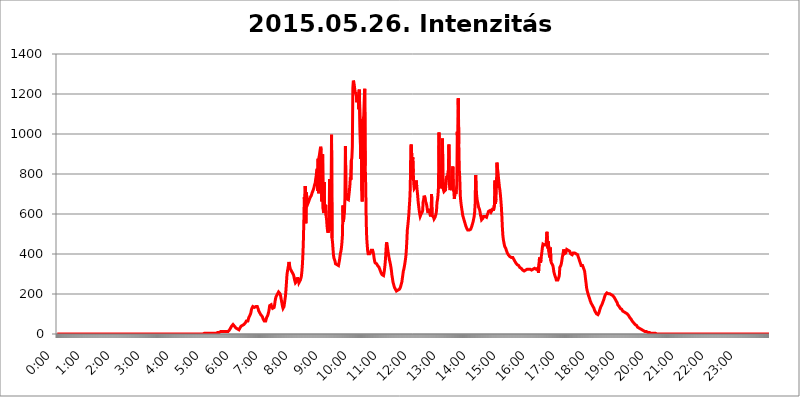
| Category | 2015.05.26. Intenzitás [W/m^2] |
|---|---|
| 0.0 | 0 |
| 0.0006944444444444445 | 0 |
| 0.001388888888888889 | 0 |
| 0.0020833333333333333 | 0 |
| 0.002777777777777778 | 0 |
| 0.003472222222222222 | 0 |
| 0.004166666666666667 | 0 |
| 0.004861111111111111 | 0 |
| 0.005555555555555556 | 0 |
| 0.0062499999999999995 | 0 |
| 0.006944444444444444 | 0 |
| 0.007638888888888889 | 0 |
| 0.008333333333333333 | 0 |
| 0.009027777777777779 | 0 |
| 0.009722222222222222 | 0 |
| 0.010416666666666666 | 0 |
| 0.011111111111111112 | 0 |
| 0.011805555555555555 | 0 |
| 0.012499999999999999 | 0 |
| 0.013194444444444444 | 0 |
| 0.013888888888888888 | 0 |
| 0.014583333333333332 | 0 |
| 0.015277777777777777 | 0 |
| 0.015972222222222224 | 0 |
| 0.016666666666666666 | 0 |
| 0.017361111111111112 | 0 |
| 0.018055555555555557 | 0 |
| 0.01875 | 0 |
| 0.019444444444444445 | 0 |
| 0.02013888888888889 | 0 |
| 0.020833333333333332 | 0 |
| 0.02152777777777778 | 0 |
| 0.022222222222222223 | 0 |
| 0.02291666666666667 | 0 |
| 0.02361111111111111 | 0 |
| 0.024305555555555556 | 0 |
| 0.024999999999999998 | 0 |
| 0.025694444444444447 | 0 |
| 0.02638888888888889 | 0 |
| 0.027083333333333334 | 0 |
| 0.027777777777777776 | 0 |
| 0.02847222222222222 | 0 |
| 0.029166666666666664 | 0 |
| 0.029861111111111113 | 0 |
| 0.030555555555555555 | 0 |
| 0.03125 | 0 |
| 0.03194444444444445 | 0 |
| 0.03263888888888889 | 0 |
| 0.03333333333333333 | 0 |
| 0.034027777777777775 | 0 |
| 0.034722222222222224 | 0 |
| 0.035416666666666666 | 0 |
| 0.036111111111111115 | 0 |
| 0.03680555555555556 | 0 |
| 0.0375 | 0 |
| 0.03819444444444444 | 0 |
| 0.03888888888888889 | 0 |
| 0.03958333333333333 | 0 |
| 0.04027777777777778 | 0 |
| 0.04097222222222222 | 0 |
| 0.041666666666666664 | 0 |
| 0.042361111111111106 | 0 |
| 0.04305555555555556 | 0 |
| 0.043750000000000004 | 0 |
| 0.044444444444444446 | 0 |
| 0.04513888888888889 | 0 |
| 0.04583333333333334 | 0 |
| 0.04652777777777778 | 0 |
| 0.04722222222222222 | 0 |
| 0.04791666666666666 | 0 |
| 0.04861111111111111 | 0 |
| 0.049305555555555554 | 0 |
| 0.049999999999999996 | 0 |
| 0.05069444444444445 | 0 |
| 0.051388888888888894 | 0 |
| 0.052083333333333336 | 0 |
| 0.05277777777777778 | 0 |
| 0.05347222222222222 | 0 |
| 0.05416666666666667 | 0 |
| 0.05486111111111111 | 0 |
| 0.05555555555555555 | 0 |
| 0.05625 | 0 |
| 0.05694444444444444 | 0 |
| 0.057638888888888885 | 0 |
| 0.05833333333333333 | 0 |
| 0.05902777777777778 | 0 |
| 0.059722222222222225 | 0 |
| 0.06041666666666667 | 0 |
| 0.061111111111111116 | 0 |
| 0.06180555555555556 | 0 |
| 0.0625 | 0 |
| 0.06319444444444444 | 0 |
| 0.06388888888888888 | 0 |
| 0.06458333333333334 | 0 |
| 0.06527777777777778 | 0 |
| 0.06597222222222222 | 0 |
| 0.06666666666666667 | 0 |
| 0.06736111111111111 | 0 |
| 0.06805555555555555 | 0 |
| 0.06874999999999999 | 0 |
| 0.06944444444444443 | 0 |
| 0.07013888888888889 | 0 |
| 0.07083333333333333 | 0 |
| 0.07152777777777779 | 0 |
| 0.07222222222222223 | 0 |
| 0.07291666666666667 | 0 |
| 0.07361111111111111 | 0 |
| 0.07430555555555556 | 0 |
| 0.075 | 0 |
| 0.07569444444444444 | 0 |
| 0.0763888888888889 | 0 |
| 0.07708333333333334 | 0 |
| 0.07777777777777778 | 0 |
| 0.07847222222222222 | 0 |
| 0.07916666666666666 | 0 |
| 0.0798611111111111 | 0 |
| 0.08055555555555556 | 0 |
| 0.08125 | 0 |
| 0.08194444444444444 | 0 |
| 0.08263888888888889 | 0 |
| 0.08333333333333333 | 0 |
| 0.08402777777777777 | 0 |
| 0.08472222222222221 | 0 |
| 0.08541666666666665 | 0 |
| 0.08611111111111112 | 0 |
| 0.08680555555555557 | 0 |
| 0.08750000000000001 | 0 |
| 0.08819444444444445 | 0 |
| 0.08888888888888889 | 0 |
| 0.08958333333333333 | 0 |
| 0.09027777777777778 | 0 |
| 0.09097222222222222 | 0 |
| 0.09166666666666667 | 0 |
| 0.09236111111111112 | 0 |
| 0.09305555555555556 | 0 |
| 0.09375 | 0 |
| 0.09444444444444444 | 0 |
| 0.09513888888888888 | 0 |
| 0.09583333333333333 | 0 |
| 0.09652777777777777 | 0 |
| 0.09722222222222222 | 0 |
| 0.09791666666666667 | 0 |
| 0.09861111111111111 | 0 |
| 0.09930555555555555 | 0 |
| 0.09999999999999999 | 0 |
| 0.10069444444444443 | 0 |
| 0.1013888888888889 | 0 |
| 0.10208333333333335 | 0 |
| 0.10277777777777779 | 0 |
| 0.10347222222222223 | 0 |
| 0.10416666666666667 | 0 |
| 0.10486111111111111 | 0 |
| 0.10555555555555556 | 0 |
| 0.10625 | 0 |
| 0.10694444444444444 | 0 |
| 0.1076388888888889 | 0 |
| 0.10833333333333334 | 0 |
| 0.10902777777777778 | 0 |
| 0.10972222222222222 | 0 |
| 0.1111111111111111 | 0 |
| 0.11180555555555556 | 0 |
| 0.11180555555555556 | 0 |
| 0.1125 | 0 |
| 0.11319444444444444 | 0 |
| 0.11388888888888889 | 0 |
| 0.11458333333333333 | 0 |
| 0.11527777777777777 | 0 |
| 0.11597222222222221 | 0 |
| 0.11666666666666665 | 0 |
| 0.1173611111111111 | 0 |
| 0.11805555555555557 | 0 |
| 0.11944444444444445 | 0 |
| 0.12013888888888889 | 0 |
| 0.12083333333333333 | 0 |
| 0.12152777777777778 | 0 |
| 0.12222222222222223 | 0 |
| 0.12291666666666667 | 0 |
| 0.12291666666666667 | 0 |
| 0.12361111111111112 | 0 |
| 0.12430555555555556 | 0 |
| 0.125 | 0 |
| 0.12569444444444444 | 0 |
| 0.12638888888888888 | 0 |
| 0.12708333333333333 | 0 |
| 0.16875 | 0 |
| 0.12847222222222224 | 0 |
| 0.12916666666666668 | 0 |
| 0.12986111111111112 | 0 |
| 0.13055555555555556 | 0 |
| 0.13125 | 0 |
| 0.13194444444444445 | 0 |
| 0.1326388888888889 | 0 |
| 0.13333333333333333 | 0 |
| 0.13402777777777777 | 0 |
| 0.13402777777777777 | 0 |
| 0.13472222222222222 | 0 |
| 0.13541666666666666 | 0 |
| 0.1361111111111111 | 0 |
| 0.13749999999999998 | 0 |
| 0.13819444444444443 | 0 |
| 0.1388888888888889 | 0 |
| 0.13958333333333334 | 0 |
| 0.14027777777777778 | 0 |
| 0.14097222222222222 | 0 |
| 0.14166666666666666 | 0 |
| 0.1423611111111111 | 0 |
| 0.14305555555555557 | 0 |
| 0.14375000000000002 | 0 |
| 0.14444444444444446 | 0 |
| 0.1451388888888889 | 0 |
| 0.1451388888888889 | 0 |
| 0.14652777777777778 | 0 |
| 0.14722222222222223 | 0 |
| 0.14791666666666667 | 0 |
| 0.1486111111111111 | 0 |
| 0.14930555555555555 | 0 |
| 0.15 | 0 |
| 0.15069444444444444 | 0 |
| 0.15138888888888888 | 0 |
| 0.15208333333333332 | 0 |
| 0.15277777777777776 | 0 |
| 0.15347222222222223 | 0 |
| 0.15416666666666667 | 0 |
| 0.15486111111111112 | 0 |
| 0.15555555555555556 | 0 |
| 0.15625 | 0 |
| 0.15694444444444444 | 0 |
| 0.15763888888888888 | 0 |
| 0.15833333333333333 | 0 |
| 0.15902777777777777 | 0 |
| 0.15972222222222224 | 0 |
| 0.16041666666666668 | 0 |
| 0.16111111111111112 | 0 |
| 0.16180555555555556 | 0 |
| 0.1625 | 0 |
| 0.16319444444444445 | 0 |
| 0.1638888888888889 | 0 |
| 0.16458333333333333 | 0 |
| 0.16527777777777777 | 0 |
| 0.16597222222222222 | 0 |
| 0.16666666666666666 | 0 |
| 0.1673611111111111 | 0 |
| 0.16805555555555554 | 0 |
| 0.16874999999999998 | 0 |
| 0.16944444444444443 | 0 |
| 0.17013888888888887 | 0 |
| 0.1708333333333333 | 0 |
| 0.17152777777777775 | 0 |
| 0.17222222222222225 | 0 |
| 0.1729166666666667 | 0 |
| 0.17361111111111113 | 0 |
| 0.17430555555555557 | 0 |
| 0.17500000000000002 | 0 |
| 0.17569444444444446 | 0 |
| 0.1763888888888889 | 0 |
| 0.17708333333333334 | 0 |
| 0.17777777777777778 | 0 |
| 0.17847222222222223 | 0 |
| 0.17916666666666667 | 0 |
| 0.1798611111111111 | 0 |
| 0.18055555555555555 | 0 |
| 0.18125 | 0 |
| 0.18194444444444444 | 0 |
| 0.1826388888888889 | 0 |
| 0.18333333333333335 | 0 |
| 0.1840277777777778 | 0 |
| 0.18472222222222223 | 0 |
| 0.18541666666666667 | 0 |
| 0.18611111111111112 | 0 |
| 0.18680555555555556 | 0 |
| 0.1875 | 0 |
| 0.18819444444444444 | 0 |
| 0.18888888888888888 | 0 |
| 0.18958333333333333 | 0 |
| 0.19027777777777777 | 0 |
| 0.1909722222222222 | 0 |
| 0.19166666666666665 | 0 |
| 0.19236111111111112 | 0 |
| 0.19305555555555554 | 0 |
| 0.19375 | 0 |
| 0.19444444444444445 | 0 |
| 0.1951388888888889 | 0 |
| 0.19583333333333333 | 0 |
| 0.19652777777777777 | 0 |
| 0.19722222222222222 | 0 |
| 0.19791666666666666 | 0 |
| 0.1986111111111111 | 0 |
| 0.19930555555555554 | 0 |
| 0.19999999999999998 | 0 |
| 0.20069444444444443 | 0 |
| 0.20138888888888887 | 0 |
| 0.2020833333333333 | 0 |
| 0.2027777777777778 | 0 |
| 0.2034722222222222 | 0 |
| 0.2041666666666667 | 0 |
| 0.20486111111111113 | 0 |
| 0.20555555555555557 | 0 |
| 0.20625000000000002 | 3.525 |
| 0.20694444444444446 | 3.525 |
| 0.2076388888888889 | 3.525 |
| 0.20833333333333334 | 3.525 |
| 0.20902777777777778 | 3.525 |
| 0.20972222222222223 | 3.525 |
| 0.21041666666666667 | 3.525 |
| 0.2111111111111111 | 3.525 |
| 0.21180555555555555 | 3.525 |
| 0.2125 | 3.525 |
| 0.21319444444444444 | 3.525 |
| 0.2138888888888889 | 3.525 |
| 0.21458333333333335 | 3.525 |
| 0.2152777777777778 | 7.887 |
| 0.21597222222222223 | 3.525 |
| 0.21666666666666667 | 3.525 |
| 0.21736111111111112 | 3.525 |
| 0.21805555555555556 | 3.525 |
| 0.21875 | 3.525 |
| 0.21944444444444444 | 3.525 |
| 0.22013888888888888 | 3.525 |
| 0.22083333333333333 | 3.525 |
| 0.22152777777777777 | 3.525 |
| 0.2222222222222222 | 3.525 |
| 0.22291666666666665 | 3.525 |
| 0.2236111111111111 | 3.525 |
| 0.22430555555555556 | 7.887 |
| 0.225 | 7.887 |
| 0.22569444444444445 | 7.887 |
| 0.2263888888888889 | 7.887 |
| 0.22708333333333333 | 7.887 |
| 0.22777777777777777 | 12.257 |
| 0.22847222222222222 | 12.257 |
| 0.22916666666666666 | 12.257 |
| 0.2298611111111111 | 12.257 |
| 0.23055555555555554 | 12.257 |
| 0.23124999999999998 | 12.257 |
| 0.23194444444444443 | 12.257 |
| 0.23263888888888887 | 12.257 |
| 0.2333333333333333 | 12.257 |
| 0.2340277777777778 | 12.257 |
| 0.2347222222222222 | 12.257 |
| 0.2354166666666667 | 12.257 |
| 0.23611111111111113 | 12.257 |
| 0.23680555555555557 | 12.257 |
| 0.23750000000000002 | 12.257 |
| 0.23819444444444446 | 12.257 |
| 0.2388888888888889 | 12.257 |
| 0.23958333333333334 | 12.257 |
| 0.24027777777777778 | 16.636 |
| 0.24097222222222223 | 16.636 |
| 0.24166666666666667 | 21.024 |
| 0.2423611111111111 | 25.419 |
| 0.24305555555555555 | 29.823 |
| 0.24375 | 34.234 |
| 0.24444444444444446 | 38.653 |
| 0.24513888888888888 | 43.079 |
| 0.24583333333333335 | 43.079 |
| 0.2465277777777778 | 47.511 |
| 0.24722222222222223 | 43.079 |
| 0.24791666666666667 | 43.079 |
| 0.24861111111111112 | 38.653 |
| 0.24930555555555556 | 34.234 |
| 0.25 | 34.234 |
| 0.25069444444444444 | 29.823 |
| 0.2513888888888889 | 29.823 |
| 0.2520833333333333 | 25.419 |
| 0.25277777777777777 | 25.419 |
| 0.2534722222222222 | 21.024 |
| 0.25416666666666665 | 21.024 |
| 0.2548611111111111 | 21.024 |
| 0.2555555555555556 | 25.419 |
| 0.25625000000000003 | 29.823 |
| 0.2569444444444445 | 34.234 |
| 0.2576388888888889 | 38.653 |
| 0.25833333333333336 | 38.653 |
| 0.2590277777777778 | 43.079 |
| 0.25972222222222224 | 43.079 |
| 0.2604166666666667 | 43.079 |
| 0.2611111111111111 | 47.511 |
| 0.26180555555555557 | 47.511 |
| 0.2625 | 51.951 |
| 0.26319444444444445 | 51.951 |
| 0.2638888888888889 | 56.398 |
| 0.26458333333333334 | 60.85 |
| 0.2652777777777778 | 65.31 |
| 0.2659722222222222 | 60.85 |
| 0.26666666666666666 | 60.85 |
| 0.2673611111111111 | 65.31 |
| 0.26805555555555555 | 74.246 |
| 0.26875 | 83.205 |
| 0.26944444444444443 | 87.692 |
| 0.2701388888888889 | 92.184 |
| 0.2708333333333333 | 96.682 |
| 0.27152777777777776 | 105.69 |
| 0.2722222222222222 | 119.235 |
| 0.27291666666666664 | 128.284 |
| 0.2736111111111111 | 132.814 |
| 0.2743055555555555 | 137.347 |
| 0.27499999999999997 | 137.347 |
| 0.27569444444444446 | 137.347 |
| 0.27638888888888885 | 132.814 |
| 0.27708333333333335 | 137.347 |
| 0.2777777777777778 | 137.347 |
| 0.27847222222222223 | 137.347 |
| 0.2791666666666667 | 141.884 |
| 0.2798611111111111 | 141.884 |
| 0.28055555555555556 | 137.347 |
| 0.28125 | 132.814 |
| 0.28194444444444444 | 123.758 |
| 0.2826388888888889 | 114.716 |
| 0.2833333333333333 | 110.201 |
| 0.28402777777777777 | 105.69 |
| 0.2847222222222222 | 101.184 |
| 0.28541666666666665 | 96.682 |
| 0.28611111111111115 | 92.184 |
| 0.28680555555555554 | 92.184 |
| 0.28750000000000003 | 87.692 |
| 0.2881944444444445 | 83.205 |
| 0.2888888888888889 | 74.246 |
| 0.28958333333333336 | 69.775 |
| 0.2902777777777778 | 65.31 |
| 0.29097222222222224 | 60.85 |
| 0.2916666666666667 | 60.85 |
| 0.2923611111111111 | 65.31 |
| 0.29305555555555557 | 74.246 |
| 0.29375 | 83.205 |
| 0.29444444444444445 | 87.692 |
| 0.2951388888888889 | 92.184 |
| 0.29583333333333334 | 101.184 |
| 0.2965277777777778 | 110.201 |
| 0.2972222222222222 | 123.758 |
| 0.29791666666666666 | 141.884 |
| 0.2986111111111111 | 146.423 |
| 0.29930555555555555 | 146.423 |
| 0.3 | 146.423 |
| 0.30069444444444443 | 137.347 |
| 0.3013888888888889 | 132.814 |
| 0.3020833333333333 | 128.284 |
| 0.30277777777777776 | 128.284 |
| 0.3034722222222222 | 123.758 |
| 0.30416666666666664 | 132.814 |
| 0.3048611111111111 | 146.423 |
| 0.3055555555555555 | 164.605 |
| 0.30624999999999997 | 178.264 |
| 0.3069444444444444 | 187.378 |
| 0.3076388888888889 | 191.937 |
| 0.30833333333333335 | 196.497 |
| 0.3090277777777778 | 196.497 |
| 0.30972222222222223 | 201.058 |
| 0.3104166666666667 | 210.182 |
| 0.3111111111111111 | 214.746 |
| 0.31180555555555556 | 210.182 |
| 0.3125 | 201.058 |
| 0.31319444444444444 | 191.937 |
| 0.3138888888888889 | 178.264 |
| 0.3145833333333333 | 164.605 |
| 0.31527777777777777 | 150.964 |
| 0.3159722222222222 | 137.347 |
| 0.31666666666666665 | 128.284 |
| 0.31736111111111115 | 128.284 |
| 0.31805555555555554 | 137.347 |
| 0.31875000000000003 | 155.509 |
| 0.3194444444444445 | 173.709 |
| 0.3201388888888889 | 191.937 |
| 0.32083333333333336 | 223.873 |
| 0.3215277777777778 | 260.373 |
| 0.32222222222222224 | 296.808 |
| 0.3229166666666667 | 314.98 |
| 0.3236111111111111 | 328.584 |
| 0.32430555555555557 | 342.162 |
| 0.325 | 360.221 |
| 0.32569444444444445 | 346.682 |
| 0.3263888888888889 | 333.113 |
| 0.32708333333333334 | 324.052 |
| 0.3277777777777778 | 324.052 |
| 0.3284722222222222 | 314.98 |
| 0.32916666666666666 | 310.44 |
| 0.3298611111111111 | 305.898 |
| 0.33055555555555555 | 301.354 |
| 0.33125 | 296.808 |
| 0.33194444444444443 | 287.709 |
| 0.3326388888888889 | 274.047 |
| 0.3333333333333333 | 264.932 |
| 0.3340277777777778 | 255.813 |
| 0.3347222222222222 | 251.251 |
| 0.3354166666666667 | 251.251 |
| 0.3361111111111111 | 264.932 |
| 0.3368055555555556 | 283.156 |
| 0.33749999999999997 | 278.603 |
| 0.33819444444444446 | 269.49 |
| 0.33888888888888885 | 255.813 |
| 0.33958333333333335 | 255.813 |
| 0.34027777777777773 | 260.373 |
| 0.34097222222222223 | 269.49 |
| 0.3416666666666666 | 278.603 |
| 0.3423611111111111 | 287.709 |
| 0.3430555555555555 | 310.44 |
| 0.34375 | 342.162 |
| 0.3444444444444445 | 387.202 |
| 0.3451388888888889 | 458.38 |
| 0.3458333333333334 | 558.261 |
| 0.34652777777777777 | 683.473 |
| 0.34722222222222227 | 638.256 |
| 0.34791666666666665 | 739.877 |
| 0.34861111111111115 | 553.986 |
| 0.34930555555555554 | 707.8 |
| 0.35000000000000003 | 683.473 |
| 0.3506944444444444 | 658.909 |
| 0.3513888888888889 | 650.667 |
| 0.3520833333333333 | 654.791 |
| 0.3527777777777778 | 663.019 |
| 0.3534722222222222 | 671.22 |
| 0.3541666666666667 | 675.311 |
| 0.3548611111111111 | 683.473 |
| 0.35555555555555557 | 687.544 |
| 0.35625 | 691.608 |
| 0.35694444444444445 | 699.717 |
| 0.3576388888888889 | 707.8 |
| 0.35833333333333334 | 711.832 |
| 0.3590277777777778 | 719.877 |
| 0.3597222222222222 | 727.896 |
| 0.36041666666666666 | 731.896 |
| 0.3611111111111111 | 747.834 |
| 0.36180555555555555 | 755.766 |
| 0.3625 | 775.492 |
| 0.36319444444444443 | 791.169 |
| 0.3638888888888889 | 814.519 |
| 0.3645833333333333 | 826.123 |
| 0.3652777777777778 | 715.858 |
| 0.3659722222222222 | 875.918 |
| 0.3666666666666667 | 703.762 |
| 0.3673611111111111 | 887.309 |
| 0.3680555555555556 | 891.099 |
| 0.36874999999999997 | 921.298 |
| 0.36944444444444446 | 936.33 |
| 0.37013888888888885 | 917.534 |
| 0.37083333333333335 | 663.019 |
| 0.37152777777777773 | 814.519 |
| 0.37222222222222223 | 898.668 |
| 0.3729166666666666 | 625.784 |
| 0.3736111111111111 | 604.864 |
| 0.3743055555555555 | 759.723 |
| 0.375 | 617.436 |
| 0.3756944444444445 | 613.252 |
| 0.3763888888888889 | 646.537 |
| 0.3770833333333334 | 592.233 |
| 0.37777777777777777 | 571.049 |
| 0.37847222222222227 | 536.82 |
| 0.37916666666666665 | 515.223 |
| 0.37986111111111115 | 506.542 |
| 0.38055555555555554 | 519.555 |
| 0.38125000000000003 | 536.82 |
| 0.3819444444444444 | 775.492 |
| 0.3826388888888889 | 532.513 |
| 0.3833333333333333 | 515.223 |
| 0.3840277777777778 | 671.22 |
| 0.3847222222222222 | 996.182 |
| 0.3854166666666667 | 480.356 |
| 0.3861111111111111 | 458.38 |
| 0.38680555555555557 | 422.943 |
| 0.3875 | 391.685 |
| 0.38819444444444445 | 378.224 |
| 0.3888888888888889 | 382.715 |
| 0.38958333333333334 | 364.728 |
| 0.3902777777777778 | 351.198 |
| 0.3909722222222222 | 346.682 |
| 0.39166666666666666 | 346.682 |
| 0.3923611111111111 | 346.682 |
| 0.39305555555555555 | 346.682 |
| 0.39375 | 342.162 |
| 0.39444444444444443 | 342.162 |
| 0.3951388888888889 | 346.682 |
| 0.3958333333333333 | 369.23 |
| 0.3965277777777778 | 387.202 |
| 0.3972222222222222 | 405.108 |
| 0.3979166666666667 | 414.035 |
| 0.3986111111111111 | 431.833 |
| 0.3993055555555556 | 458.38 |
| 0.39999999999999997 | 493.475 |
| 0.40069444444444446 | 642.4 |
| 0.40138888888888885 | 562.53 |
| 0.40208333333333335 | 588.009 |
| 0.40277777777777773 | 604.864 |
| 0.40347222222222223 | 679.395 |
| 0.4041666666666666 | 940.082 |
| 0.4048611111111111 | 711.832 |
| 0.4055555555555555 | 687.544 |
| 0.40625 | 675.311 |
| 0.4069444444444445 | 675.311 |
| 0.4076388888888889 | 675.311 |
| 0.4083333333333334 | 671.22 |
| 0.40902777777777777 | 675.311 |
| 0.40972222222222227 | 715.858 |
| 0.41041666666666665 | 743.859 |
| 0.41111111111111115 | 783.342 |
| 0.41180555555555554 | 771.559 |
| 0.41250000000000003 | 868.305 |
| 0.4131944444444444 | 879.719 |
| 0.4138888888888889 | 936.33 |
| 0.4145833333333333 | 1229.899 |
| 0.4152777777777778 | 1266.8 |
| 0.4159722222222222 | 1258.511 |
| 0.4166666666666667 | 1242.089 |
| 0.4173611111111111 | 1221.83 |
| 0.41805555555555557 | 1201.843 |
| 0.41875 | 1209.807 |
| 0.41944444444444445 | 1193.918 |
| 0.4201388888888889 | 1158.689 |
| 0.42083333333333334 | 1193.918 |
| 0.4215277777777778 | 1186.03 |
| 0.4222222222222222 | 1174.263 |
| 0.42291666666666666 | 1124.056 |
| 0.4236111111111111 | 1221.83 |
| 0.42430555555555555 | 1225.859 |
| 0.425 | 1217.812 |
| 0.42569444444444443 | 875.918 |
| 0.4263888888888889 | 1074.789 |
| 0.4270833333333333 | 715.858 |
| 0.4277777777777778 | 663.019 |
| 0.4284722222222222 | 658.909 |
| 0.4291666666666667 | 1074.789 |
| 0.4298611111111111 | 1089.873 |
| 0.4305555555555556 | 1170.358 |
| 0.43124999999999997 | 1225.859 |
| 0.43194444444444446 | 841.526 |
| 0.43263888888888885 | 739.877 |
| 0.43333333333333335 | 562.53 |
| 0.43402777777777773 | 480.356 |
| 0.43472222222222223 | 445.129 |
| 0.4354166666666666 | 414.035 |
| 0.4361111111111111 | 400.638 |
| 0.4368055555555555 | 396.164 |
| 0.4375 | 396.164 |
| 0.4381944444444445 | 400.638 |
| 0.4388888888888889 | 405.108 |
| 0.4395833333333334 | 409.574 |
| 0.44027777777777777 | 418.492 |
| 0.44097222222222227 | 418.492 |
| 0.44166666666666665 | 418.492 |
| 0.44236111111111115 | 418.492 |
| 0.44305555555555554 | 409.574 |
| 0.44375000000000003 | 396.164 |
| 0.4444444444444444 | 378.224 |
| 0.4451388888888889 | 364.728 |
| 0.4458333333333333 | 355.712 |
| 0.4465277777777778 | 351.198 |
| 0.4472222222222222 | 351.198 |
| 0.4479166666666667 | 351.198 |
| 0.4486111111111111 | 346.682 |
| 0.44930555555555557 | 342.162 |
| 0.45 | 342.162 |
| 0.45069444444444445 | 342.162 |
| 0.4513888888888889 | 333.113 |
| 0.45208333333333334 | 328.584 |
| 0.4527777777777778 | 319.517 |
| 0.4534722222222222 | 314.98 |
| 0.45416666666666666 | 305.898 |
| 0.4548611111111111 | 301.354 |
| 0.45555555555555555 | 296.808 |
| 0.45625 | 292.259 |
| 0.45694444444444443 | 292.259 |
| 0.4576388888888889 | 292.259 |
| 0.4583333333333333 | 305.898 |
| 0.4590277777777778 | 324.052 |
| 0.4597222222222222 | 346.682 |
| 0.4604166666666667 | 378.224 |
| 0.4611111111111111 | 422.943 |
| 0.4618055555555556 | 458.38 |
| 0.46249999999999997 | 449.551 |
| 0.46319444444444446 | 431.833 |
| 0.46388888888888885 | 414.035 |
| 0.46458333333333335 | 396.164 |
| 0.46527777777777773 | 382.715 |
| 0.46597222222222223 | 369.23 |
| 0.4666666666666666 | 360.221 |
| 0.4673611111111111 | 346.682 |
| 0.4680555555555555 | 333.113 |
| 0.46875 | 314.98 |
| 0.4694444444444445 | 292.259 |
| 0.4701388888888889 | 278.603 |
| 0.4708333333333334 | 260.373 |
| 0.47152777777777777 | 251.251 |
| 0.47222222222222227 | 242.127 |
| 0.47291666666666665 | 233 |
| 0.47361111111111115 | 228.436 |
| 0.47430555555555554 | 223.873 |
| 0.47500000000000003 | 219.309 |
| 0.4756944444444444 | 214.746 |
| 0.4763888888888889 | 210.182 |
| 0.4770833333333333 | 214.746 |
| 0.4777777777777778 | 219.309 |
| 0.4784722222222222 | 223.873 |
| 0.4791666666666667 | 223.873 |
| 0.4798611111111111 | 223.873 |
| 0.48055555555555557 | 223.873 |
| 0.48125 | 233 |
| 0.48194444444444445 | 237.564 |
| 0.4826388888888889 | 251.251 |
| 0.48333333333333334 | 260.373 |
| 0.4840277777777778 | 278.603 |
| 0.4847222222222222 | 296.808 |
| 0.48541666666666666 | 314.98 |
| 0.4861111111111111 | 324.052 |
| 0.48680555555555555 | 337.639 |
| 0.4875 | 351.198 |
| 0.48819444444444443 | 369.23 |
| 0.4888888888888889 | 387.202 |
| 0.4895833333333333 | 418.492 |
| 0.4902777777777778 | 462.786 |
| 0.4909722222222222 | 519.555 |
| 0.4916666666666667 | 541.121 |
| 0.4923611111111111 | 566.793 |
| 0.4930555555555556 | 596.45 |
| 0.49374999999999997 | 634.105 |
| 0.49444444444444446 | 671.22 |
| 0.49513888888888885 | 731.896 |
| 0.49583333333333335 | 928.819 |
| 0.49652777777777773 | 947.58 |
| 0.49722222222222223 | 887.309 |
| 0.4979166666666666 | 849.199 |
| 0.4986111111111111 | 883.516 |
| 0.4993055555555555 | 806.757 |
| 0.5 | 751.803 |
| 0.5006944444444444 | 727.896 |
| 0.5013888888888889 | 723.889 |
| 0.5020833333333333 | 723.889 |
| 0.5027777777777778 | 739.877 |
| 0.5034722222222222 | 767.62 |
| 0.5041666666666667 | 739.877 |
| 0.5048611111111111 | 735.89 |
| 0.5055555555555555 | 691.608 |
| 0.50625 | 658.909 |
| 0.5069444444444444 | 638.256 |
| 0.5076388888888889 | 617.436 |
| 0.5083333333333333 | 600.661 |
| 0.5090277777777777 | 588.009 |
| 0.5097222222222222 | 592.233 |
| 0.5104166666666666 | 600.661 |
| 0.5111111111111112 | 600.661 |
| 0.5118055555555555 | 609.062 |
| 0.5125000000000001 | 617.436 |
| 0.5131944444444444 | 663.019 |
| 0.513888888888889 | 671.22 |
| 0.5145833333333333 | 691.608 |
| 0.5152777777777778 | 695.666 |
| 0.5159722222222222 | 679.395 |
| 0.5166666666666667 | 663.019 |
| 0.517361111111111 | 654.791 |
| 0.5180555555555556 | 646.537 |
| 0.5187499999999999 | 629.948 |
| 0.5194444444444445 | 613.252 |
| 0.5201388888888888 | 604.864 |
| 0.5208333333333334 | 609.062 |
| 0.5215277777777778 | 625.784 |
| 0.5222222222222223 | 613.252 |
| 0.5229166666666667 | 596.45 |
| 0.5236111111111111 | 588.009 |
| 0.5243055555555556 | 600.661 |
| 0.525 | 699.717 |
| 0.5256944444444445 | 592.233 |
| 0.5263888888888889 | 592.233 |
| 0.5270833333333333 | 592.233 |
| 0.5277777777777778 | 583.779 |
| 0.5284722222222222 | 575.299 |
| 0.5291666666666667 | 579.542 |
| 0.5298611111111111 | 583.779 |
| 0.5305555555555556 | 588.009 |
| 0.53125 | 600.661 |
| 0.5319444444444444 | 617.436 |
| 0.5326388888888889 | 658.909 |
| 0.5333333333333333 | 671.22 |
| 0.5340277777777778 | 695.666 |
| 0.5347222222222222 | 735.89 |
| 0.5354166666666667 | 1007.383 |
| 0.5361111111111111 | 767.62 |
| 0.5368055555555555 | 849.199 |
| 0.5375 | 806.757 |
| 0.5381944444444444 | 779.42 |
| 0.5388888888888889 | 727.896 |
| 0.5395833333333333 | 735.89 |
| 0.5402777777777777 | 977.508 |
| 0.5409722222222222 | 739.877 |
| 0.5416666666666666 | 719.877 |
| 0.5423611111111112 | 711.832 |
| 0.5430555555555555 | 711.832 |
| 0.5437500000000001 | 711.832 |
| 0.5444444444444444 | 719.877 |
| 0.545138888888889 | 747.834 |
| 0.5458333333333333 | 775.492 |
| 0.5465277777777778 | 791.169 |
| 0.5472222222222222 | 771.559 |
| 0.5479166666666667 | 771.559 |
| 0.548611111111111 | 818.392 |
| 0.5493055555555556 | 947.58 |
| 0.5499999999999999 | 747.834 |
| 0.5506944444444445 | 719.877 |
| 0.5513888888888888 | 719.877 |
| 0.5520833333333334 | 723.889 |
| 0.5527777777777778 | 735.89 |
| 0.5534722222222223 | 759.723 |
| 0.5541666666666667 | 818.392 |
| 0.5548611111111111 | 837.682 |
| 0.5555555555555556 | 719.877 |
| 0.55625 | 711.832 |
| 0.5569444444444445 | 675.311 |
| 0.5576388888888889 | 699.717 |
| 0.5583333333333333 | 715.858 |
| 0.5590277777777778 | 699.717 |
| 0.5597222222222222 | 719.877 |
| 0.5604166666666667 | 747.834 |
| 0.5611111111111111 | 1011.118 |
| 0.5618055555555556 | 868.305 |
| 0.5625 | 1178.177 |
| 0.5631944444444444 | 951.327 |
| 0.5638888888888889 | 822.26 |
| 0.5645833333333333 | 775.492 |
| 0.5652777777777778 | 691.608 |
| 0.5659722222222222 | 663.019 |
| 0.5666666666666667 | 642.4 |
| 0.5673611111111111 | 625.784 |
| 0.5680555555555555 | 609.062 |
| 0.56875 | 592.233 |
| 0.5694444444444444 | 583.779 |
| 0.5701388888888889 | 575.299 |
| 0.5708333333333333 | 566.793 |
| 0.5715277777777777 | 558.261 |
| 0.5722222222222222 | 549.704 |
| 0.5729166666666666 | 541.121 |
| 0.5736111111111112 | 536.82 |
| 0.5743055555555555 | 528.2 |
| 0.5750000000000001 | 523.88 |
| 0.5756944444444444 | 519.555 |
| 0.576388888888889 | 519.555 |
| 0.5770833333333333 | 519.555 |
| 0.5777777777777778 | 519.555 |
| 0.5784722222222222 | 519.555 |
| 0.5791666666666667 | 519.555 |
| 0.579861111111111 | 523.88 |
| 0.5805555555555556 | 528.2 |
| 0.5812499999999999 | 536.82 |
| 0.5819444444444445 | 541.121 |
| 0.5826388888888888 | 553.986 |
| 0.5833333333333334 | 562.53 |
| 0.5840277777777778 | 575.299 |
| 0.5847222222222223 | 588.009 |
| 0.5854166666666667 | 609.062 |
| 0.5861111111111111 | 650.667 |
| 0.5868055555555556 | 795.074 |
| 0.5875 | 735.89 |
| 0.5881944444444445 | 695.666 |
| 0.5888888888888889 | 671.22 |
| 0.5895833333333333 | 658.909 |
| 0.5902777777777778 | 646.537 |
| 0.5909722222222222 | 634.105 |
| 0.5916666666666667 | 629.948 |
| 0.5923611111111111 | 621.613 |
| 0.5930555555555556 | 609.062 |
| 0.59375 | 592.233 |
| 0.5944444444444444 | 583.779 |
| 0.5951388888888889 | 571.049 |
| 0.5958333333333333 | 571.049 |
| 0.5965277777777778 | 575.299 |
| 0.5972222222222222 | 579.542 |
| 0.5979166666666667 | 588.009 |
| 0.5986111111111111 | 592.233 |
| 0.5993055555555555 | 592.233 |
| 0.6 | 588.009 |
| 0.6006944444444444 | 583.779 |
| 0.6013888888888889 | 583.779 |
| 0.6020833333333333 | 583.779 |
| 0.6027777777777777 | 592.233 |
| 0.6034722222222222 | 588.009 |
| 0.6041666666666666 | 604.864 |
| 0.6048611111111112 | 613.252 |
| 0.6055555555555555 | 617.436 |
| 0.6062500000000001 | 617.436 |
| 0.6069444444444444 | 617.436 |
| 0.607638888888889 | 617.436 |
| 0.6083333333333333 | 609.062 |
| 0.6090277777777778 | 604.864 |
| 0.6097222222222222 | 609.062 |
| 0.6104166666666667 | 621.613 |
| 0.611111111111111 | 629.948 |
| 0.6118055555555556 | 617.436 |
| 0.6124999999999999 | 613.252 |
| 0.6131944444444445 | 646.537 |
| 0.6138888888888888 | 767.62 |
| 0.6145833333333334 | 650.667 |
| 0.6152777777777778 | 675.311 |
| 0.6159722222222223 | 735.89 |
| 0.6166666666666667 | 856.855 |
| 0.6173611111111111 | 829.981 |
| 0.6180555555555556 | 810.641 |
| 0.61875 | 783.342 |
| 0.6194444444444445 | 759.723 |
| 0.6201388888888889 | 735.89 |
| 0.6208333333333333 | 719.877 |
| 0.6215277777777778 | 695.666 |
| 0.6222222222222222 | 667.123 |
| 0.6229166666666667 | 634.105 |
| 0.6236111111111111 | 588.009 |
| 0.6243055555555556 | 532.513 |
| 0.625 | 493.475 |
| 0.6256944444444444 | 471.582 |
| 0.6263888888888889 | 458.38 |
| 0.6270833333333333 | 445.129 |
| 0.6277777777777778 | 436.27 |
| 0.6284722222222222 | 431.833 |
| 0.6291666666666667 | 427.39 |
| 0.6298611111111111 | 418.492 |
| 0.6305555555555555 | 414.035 |
| 0.63125 | 405.108 |
| 0.6319444444444444 | 400.638 |
| 0.6326388888888889 | 396.164 |
| 0.6333333333333333 | 391.685 |
| 0.6340277777777777 | 391.685 |
| 0.6347222222222222 | 387.202 |
| 0.6354166666666666 | 387.202 |
| 0.6361111111111112 | 387.202 |
| 0.6368055555555555 | 382.715 |
| 0.6375000000000001 | 382.715 |
| 0.6381944444444444 | 382.715 |
| 0.638888888888889 | 382.715 |
| 0.6395833333333333 | 378.224 |
| 0.6402777777777778 | 373.729 |
| 0.6409722222222222 | 369.23 |
| 0.6416666666666667 | 364.728 |
| 0.642361111111111 | 360.221 |
| 0.6430555555555556 | 355.712 |
| 0.6437499999999999 | 351.198 |
| 0.6444444444444445 | 351.198 |
| 0.6451388888888888 | 346.682 |
| 0.6458333333333334 | 346.682 |
| 0.6465277777777778 | 342.162 |
| 0.6472222222222223 | 342.162 |
| 0.6479166666666667 | 337.639 |
| 0.6486111111111111 | 333.113 |
| 0.6493055555555556 | 333.113 |
| 0.65 | 328.584 |
| 0.6506944444444445 | 328.584 |
| 0.6513888888888889 | 324.052 |
| 0.6520833333333333 | 324.052 |
| 0.6527777777777778 | 319.517 |
| 0.6534722222222222 | 319.517 |
| 0.6541666666666667 | 314.98 |
| 0.6548611111111111 | 314.98 |
| 0.6555555555555556 | 314.98 |
| 0.65625 | 319.517 |
| 0.6569444444444444 | 319.517 |
| 0.6576388888888889 | 319.517 |
| 0.6583333333333333 | 319.517 |
| 0.6590277777777778 | 324.052 |
| 0.6597222222222222 | 324.052 |
| 0.6604166666666667 | 324.052 |
| 0.6611111111111111 | 324.052 |
| 0.6618055555555555 | 324.052 |
| 0.6625 | 324.052 |
| 0.6631944444444444 | 324.052 |
| 0.6638888888888889 | 324.052 |
| 0.6645833333333333 | 319.517 |
| 0.6652777777777777 | 319.517 |
| 0.6659722222222222 | 324.052 |
| 0.6666666666666666 | 324.052 |
| 0.6673611111111111 | 324.052 |
| 0.6680555555555556 | 324.052 |
| 0.6687500000000001 | 324.052 |
| 0.6694444444444444 | 328.584 |
| 0.6701388888888888 | 324.052 |
| 0.6708333333333334 | 328.584 |
| 0.6715277777777778 | 324.052 |
| 0.6722222222222222 | 328.584 |
| 0.6729166666666666 | 319.517 |
| 0.6736111111111112 | 328.584 |
| 0.6743055555555556 | 328.584 |
| 0.6749999999999999 | 305.898 |
| 0.6756944444444444 | 351.198 |
| 0.6763888888888889 | 382.715 |
| 0.6770833333333334 | 364.728 |
| 0.6777777777777777 | 355.712 |
| 0.6784722222222223 | 369.23 |
| 0.6791666666666667 | 396.164 |
| 0.6798611111111111 | 414.035 |
| 0.6805555555555555 | 436.27 |
| 0.68125 | 449.551 |
| 0.6819444444444445 | 449.551 |
| 0.6826388888888889 | 449.551 |
| 0.6833333333333332 | 445.129 |
| 0.6840277777777778 | 440.702 |
| 0.6847222222222222 | 440.702 |
| 0.6854166666666667 | 445.129 |
| 0.686111111111111 | 471.582 |
| 0.6868055555555556 | 510.885 |
| 0.6875 | 453.968 |
| 0.6881944444444444 | 427.39 |
| 0.688888888888889 | 462.786 |
| 0.6895833333333333 | 409.574 |
| 0.6902777777777778 | 391.685 |
| 0.6909722222222222 | 382.715 |
| 0.6916666666666668 | 431.833 |
| 0.6923611111111111 | 364.728 |
| 0.6930555555555555 | 355.712 |
| 0.69375 | 351.198 |
| 0.6944444444444445 | 351.198 |
| 0.6951388888888889 | 342.162 |
| 0.6958333333333333 | 328.584 |
| 0.6965277777777777 | 310.44 |
| 0.6972222222222223 | 301.354 |
| 0.6979166666666666 | 292.259 |
| 0.6986111111111111 | 287.709 |
| 0.6993055555555556 | 278.603 |
| 0.7000000000000001 | 269.49 |
| 0.7006944444444444 | 269.49 |
| 0.7013888888888888 | 269.49 |
| 0.7020833333333334 | 269.49 |
| 0.7027777777777778 | 274.047 |
| 0.7034722222222222 | 283.156 |
| 0.7041666666666666 | 292.259 |
| 0.7048611111111112 | 333.113 |
| 0.7055555555555556 | 333.113 |
| 0.7062499999999999 | 342.162 |
| 0.7069444444444444 | 351.198 |
| 0.7076388888888889 | 364.728 |
| 0.7083333333333334 | 382.715 |
| 0.7090277777777777 | 396.164 |
| 0.7097222222222223 | 409.574 |
| 0.7104166666666667 | 422.943 |
| 0.7111111111111111 | 400.638 |
| 0.7118055555555555 | 405.108 |
| 0.7125 | 405.108 |
| 0.7131944444444445 | 405.108 |
| 0.7138888888888889 | 414.035 |
| 0.7145833333333332 | 422.943 |
| 0.7152777777777778 | 418.492 |
| 0.7159722222222222 | 422.943 |
| 0.7166666666666667 | 418.492 |
| 0.717361111111111 | 414.035 |
| 0.7180555555555556 | 414.035 |
| 0.71875 | 414.035 |
| 0.7194444444444444 | 409.574 |
| 0.720138888888889 | 400.638 |
| 0.7208333333333333 | 396.164 |
| 0.7215277777777778 | 396.164 |
| 0.7222222222222222 | 396.164 |
| 0.7229166666666668 | 400.638 |
| 0.7236111111111111 | 405.108 |
| 0.7243055555555555 | 405.108 |
| 0.725 | 405.108 |
| 0.7256944444444445 | 405.108 |
| 0.7263888888888889 | 405.108 |
| 0.7270833333333333 | 400.638 |
| 0.7277777777777777 | 400.638 |
| 0.7284722222222223 | 400.638 |
| 0.7291666666666666 | 396.164 |
| 0.7298611111111111 | 396.164 |
| 0.7305555555555556 | 387.202 |
| 0.7312500000000001 | 382.715 |
| 0.7319444444444444 | 373.729 |
| 0.7326388888888888 | 364.728 |
| 0.7333333333333334 | 360.221 |
| 0.7340277777777778 | 351.198 |
| 0.7347222222222222 | 342.162 |
| 0.7354166666666666 | 342.162 |
| 0.7361111111111112 | 342.162 |
| 0.7368055555555556 | 342.162 |
| 0.7374999999999999 | 337.639 |
| 0.7381944444444444 | 328.584 |
| 0.7388888888888889 | 324.052 |
| 0.7395833333333334 | 314.98 |
| 0.7402777777777777 | 296.808 |
| 0.7409722222222223 | 274.047 |
| 0.7416666666666667 | 255.813 |
| 0.7423611111111111 | 233 |
| 0.7430555555555555 | 219.309 |
| 0.74375 | 210.182 |
| 0.7444444444444445 | 201.058 |
| 0.7451388888888889 | 191.937 |
| 0.7458333333333332 | 187.378 |
| 0.7465277777777778 | 178.264 |
| 0.7472222222222222 | 169.156 |
| 0.7479166666666667 | 164.605 |
| 0.748611111111111 | 155.509 |
| 0.7493055555555556 | 155.509 |
| 0.75 | 146.423 |
| 0.7506944444444444 | 141.884 |
| 0.751388888888889 | 137.347 |
| 0.7520833333333333 | 132.814 |
| 0.7527777777777778 | 128.284 |
| 0.7534722222222222 | 119.235 |
| 0.7541666666666668 | 114.716 |
| 0.7548611111111111 | 110.201 |
| 0.7555555555555555 | 105.69 |
| 0.75625 | 101.184 |
| 0.7569444444444445 | 96.682 |
| 0.7576388888888889 | 96.682 |
| 0.7583333333333333 | 96.682 |
| 0.7590277777777777 | 101.184 |
| 0.7597222222222223 | 105.69 |
| 0.7604166666666666 | 114.716 |
| 0.7611111111111111 | 123.758 |
| 0.7618055555555556 | 128.284 |
| 0.7625000000000001 | 137.347 |
| 0.7631944444444444 | 141.884 |
| 0.7638888888888888 | 146.423 |
| 0.7645833333333334 | 150.964 |
| 0.7652777777777778 | 160.056 |
| 0.7659722222222222 | 164.605 |
| 0.7666666666666666 | 173.709 |
| 0.7673611111111112 | 182.82 |
| 0.7680555555555556 | 187.378 |
| 0.7687499999999999 | 196.497 |
| 0.7694444444444444 | 201.058 |
| 0.7701388888888889 | 201.058 |
| 0.7708333333333334 | 205.62 |
| 0.7715277777777777 | 205.62 |
| 0.7722222222222223 | 205.62 |
| 0.7729166666666667 | 201.058 |
| 0.7736111111111111 | 201.058 |
| 0.7743055555555555 | 201.058 |
| 0.775 | 201.058 |
| 0.7756944444444445 | 201.058 |
| 0.7763888888888889 | 201.058 |
| 0.7770833333333332 | 196.497 |
| 0.7777777777777778 | 196.497 |
| 0.7784722222222222 | 196.497 |
| 0.7791666666666667 | 191.937 |
| 0.779861111111111 | 191.937 |
| 0.7805555555555556 | 187.378 |
| 0.78125 | 182.82 |
| 0.7819444444444444 | 178.264 |
| 0.782638888888889 | 173.709 |
| 0.7833333333333333 | 169.156 |
| 0.7840277777777778 | 164.605 |
| 0.7847222222222222 | 160.056 |
| 0.7854166666666668 | 155.509 |
| 0.7861111111111111 | 146.423 |
| 0.7868055555555555 | 146.423 |
| 0.7875 | 141.884 |
| 0.7881944444444445 | 137.347 |
| 0.7888888888888889 | 132.814 |
| 0.7895833333333333 | 128.284 |
| 0.7902777777777777 | 128.284 |
| 0.7909722222222223 | 123.758 |
| 0.7916666666666666 | 123.758 |
| 0.7923611111111111 | 119.235 |
| 0.7930555555555556 | 114.716 |
| 0.7937500000000001 | 114.716 |
| 0.7944444444444444 | 114.716 |
| 0.7951388888888888 | 110.201 |
| 0.7958333333333334 | 110.201 |
| 0.7965277777777778 | 110.201 |
| 0.7972222222222222 | 105.69 |
| 0.7979166666666666 | 101.184 |
| 0.7986111111111112 | 101.184 |
| 0.7993055555555556 | 101.184 |
| 0.7999999999999999 | 96.682 |
| 0.8006944444444444 | 96.682 |
| 0.8013888888888889 | 92.184 |
| 0.8020833333333334 | 87.692 |
| 0.8027777777777777 | 83.205 |
| 0.8034722222222223 | 83.205 |
| 0.8041666666666667 | 78.722 |
| 0.8048611111111111 | 74.246 |
| 0.8055555555555555 | 69.775 |
| 0.80625 | 65.31 |
| 0.8069444444444445 | 65.31 |
| 0.8076388888888889 | 60.85 |
| 0.8083333333333332 | 56.398 |
| 0.8090277777777778 | 51.951 |
| 0.8097222222222222 | 51.951 |
| 0.8104166666666667 | 47.511 |
| 0.811111111111111 | 47.511 |
| 0.8118055555555556 | 43.079 |
| 0.8125 | 43.079 |
| 0.8131944444444444 | 38.653 |
| 0.813888888888889 | 34.234 |
| 0.8145833333333333 | 34.234 |
| 0.8152777777777778 | 29.823 |
| 0.8159722222222222 | 29.823 |
| 0.8166666666666668 | 29.823 |
| 0.8173611111111111 | 25.419 |
| 0.8180555555555555 | 25.419 |
| 0.81875 | 21.024 |
| 0.8194444444444445 | 21.024 |
| 0.8201388888888889 | 21.024 |
| 0.8208333333333333 | 21.024 |
| 0.8215277777777777 | 16.636 |
| 0.8222222222222223 | 16.636 |
| 0.8229166666666666 | 16.636 |
| 0.8236111111111111 | 12.257 |
| 0.8243055555555556 | 12.257 |
| 0.8250000000000001 | 12.257 |
| 0.8256944444444444 | 12.257 |
| 0.8263888888888888 | 12.257 |
| 0.8270833333333334 | 12.257 |
| 0.8277777777777778 | 7.887 |
| 0.8284722222222222 | 7.887 |
| 0.8291666666666666 | 7.887 |
| 0.8298611111111112 | 7.887 |
| 0.8305555555555556 | 7.887 |
| 0.8312499999999999 | 7.887 |
| 0.8319444444444444 | 3.525 |
| 0.8326388888888889 | 3.525 |
| 0.8333333333333334 | 3.525 |
| 0.8340277777777777 | 3.525 |
| 0.8347222222222223 | 3.525 |
| 0.8354166666666667 | 3.525 |
| 0.8361111111111111 | 3.525 |
| 0.8368055555555555 | 3.525 |
| 0.8375 | 3.525 |
| 0.8381944444444445 | 3.525 |
| 0.8388888888888889 | 3.525 |
| 0.8395833333333332 | 0 |
| 0.8402777777777778 | 0 |
| 0.8409722222222222 | 0 |
| 0.8416666666666667 | 0 |
| 0.842361111111111 | 0 |
| 0.8430555555555556 | 0 |
| 0.84375 | 0 |
| 0.8444444444444444 | 0 |
| 0.845138888888889 | 0 |
| 0.8458333333333333 | 0 |
| 0.8465277777777778 | 0 |
| 0.8472222222222222 | 0 |
| 0.8479166666666668 | 0 |
| 0.8486111111111111 | 0 |
| 0.8493055555555555 | 0 |
| 0.85 | 0 |
| 0.8506944444444445 | 0 |
| 0.8513888888888889 | 0 |
| 0.8520833333333333 | 0 |
| 0.8527777777777777 | 0 |
| 0.8534722222222223 | 0 |
| 0.8541666666666666 | 0 |
| 0.8548611111111111 | 0 |
| 0.8555555555555556 | 0 |
| 0.8562500000000001 | 0 |
| 0.8569444444444444 | 0 |
| 0.8576388888888888 | 0 |
| 0.8583333333333334 | 0 |
| 0.8590277777777778 | 0 |
| 0.8597222222222222 | 0 |
| 0.8604166666666666 | 0 |
| 0.8611111111111112 | 0 |
| 0.8618055555555556 | 0 |
| 0.8624999999999999 | 0 |
| 0.8631944444444444 | 0 |
| 0.8638888888888889 | 0 |
| 0.8645833333333334 | 0 |
| 0.8652777777777777 | 0 |
| 0.8659722222222223 | 0 |
| 0.8666666666666667 | 0 |
| 0.8673611111111111 | 0 |
| 0.8680555555555555 | 0 |
| 0.86875 | 0 |
| 0.8694444444444445 | 0 |
| 0.8701388888888889 | 0 |
| 0.8708333333333332 | 0 |
| 0.8715277777777778 | 0 |
| 0.8722222222222222 | 0 |
| 0.8729166666666667 | 0 |
| 0.873611111111111 | 0 |
| 0.8743055555555556 | 0 |
| 0.875 | 0 |
| 0.8756944444444444 | 0 |
| 0.876388888888889 | 0 |
| 0.8770833333333333 | 0 |
| 0.8777777777777778 | 0 |
| 0.8784722222222222 | 0 |
| 0.8791666666666668 | 0 |
| 0.8798611111111111 | 0 |
| 0.8805555555555555 | 0 |
| 0.88125 | 0 |
| 0.8819444444444445 | 0 |
| 0.8826388888888889 | 0 |
| 0.8833333333333333 | 0 |
| 0.8840277777777777 | 0 |
| 0.8847222222222223 | 0 |
| 0.8854166666666666 | 0 |
| 0.8861111111111111 | 0 |
| 0.8868055555555556 | 0 |
| 0.8875000000000001 | 0 |
| 0.8881944444444444 | 0 |
| 0.8888888888888888 | 0 |
| 0.8895833333333334 | 0 |
| 0.8902777777777778 | 0 |
| 0.8909722222222222 | 0 |
| 0.8916666666666666 | 0 |
| 0.8923611111111112 | 0 |
| 0.8930555555555556 | 0 |
| 0.8937499999999999 | 0 |
| 0.8944444444444444 | 0 |
| 0.8951388888888889 | 0 |
| 0.8958333333333334 | 0 |
| 0.8965277777777777 | 0 |
| 0.8972222222222223 | 0 |
| 0.8979166666666667 | 0 |
| 0.8986111111111111 | 0 |
| 0.8993055555555555 | 0 |
| 0.9 | 0 |
| 0.9006944444444445 | 0 |
| 0.9013888888888889 | 0 |
| 0.9020833333333332 | 0 |
| 0.9027777777777778 | 0 |
| 0.9034722222222222 | 0 |
| 0.9041666666666667 | 0 |
| 0.904861111111111 | 0 |
| 0.9055555555555556 | 0 |
| 0.90625 | 0 |
| 0.9069444444444444 | 0 |
| 0.907638888888889 | 0 |
| 0.9083333333333333 | 0 |
| 0.9090277777777778 | 0 |
| 0.9097222222222222 | 0 |
| 0.9104166666666668 | 0 |
| 0.9111111111111111 | 0 |
| 0.9118055555555555 | 0 |
| 0.9125 | 0 |
| 0.9131944444444445 | 0 |
| 0.9138888888888889 | 0 |
| 0.9145833333333333 | 0 |
| 0.9152777777777777 | 0 |
| 0.9159722222222223 | 0 |
| 0.9166666666666666 | 0 |
| 0.9173611111111111 | 0 |
| 0.9180555555555556 | 0 |
| 0.9187500000000001 | 0 |
| 0.9194444444444444 | 0 |
| 0.9201388888888888 | 0 |
| 0.9208333333333334 | 0 |
| 0.9215277777777778 | 0 |
| 0.9222222222222222 | 0 |
| 0.9229166666666666 | 0 |
| 0.9236111111111112 | 0 |
| 0.9243055555555556 | 0 |
| 0.9249999999999999 | 0 |
| 0.9256944444444444 | 0 |
| 0.9263888888888889 | 0 |
| 0.9270833333333334 | 0 |
| 0.9277777777777777 | 0 |
| 0.9284722222222223 | 0 |
| 0.9291666666666667 | 0 |
| 0.9298611111111111 | 0 |
| 0.9305555555555555 | 0 |
| 0.93125 | 0 |
| 0.9319444444444445 | 0 |
| 0.9326388888888889 | 0 |
| 0.9333333333333332 | 0 |
| 0.9340277777777778 | 0 |
| 0.9347222222222222 | 0 |
| 0.9354166666666667 | 0 |
| 0.936111111111111 | 0 |
| 0.9368055555555556 | 0 |
| 0.9375 | 0 |
| 0.9381944444444444 | 0 |
| 0.938888888888889 | 0 |
| 0.9395833333333333 | 0 |
| 0.9402777777777778 | 0 |
| 0.9409722222222222 | 0 |
| 0.9416666666666668 | 0 |
| 0.9423611111111111 | 0 |
| 0.9430555555555555 | 0 |
| 0.94375 | 0 |
| 0.9444444444444445 | 0 |
| 0.9451388888888889 | 0 |
| 0.9458333333333333 | 0 |
| 0.9465277777777777 | 0 |
| 0.9472222222222223 | 0 |
| 0.9479166666666666 | 0 |
| 0.9486111111111111 | 0 |
| 0.9493055555555556 | 0 |
| 0.9500000000000001 | 0 |
| 0.9506944444444444 | 0 |
| 0.9513888888888888 | 0 |
| 0.9520833333333334 | 0 |
| 0.9527777777777778 | 0 |
| 0.9534722222222222 | 0 |
| 0.9541666666666666 | 0 |
| 0.9548611111111112 | 0 |
| 0.9555555555555556 | 0 |
| 0.9562499999999999 | 0 |
| 0.9569444444444444 | 0 |
| 0.9576388888888889 | 0 |
| 0.9583333333333334 | 0 |
| 0.9590277777777777 | 0 |
| 0.9597222222222223 | 0 |
| 0.9604166666666667 | 0 |
| 0.9611111111111111 | 0 |
| 0.9618055555555555 | 0 |
| 0.9625 | 0 |
| 0.9631944444444445 | 0 |
| 0.9638888888888889 | 0 |
| 0.9645833333333332 | 0 |
| 0.9652777777777778 | 0 |
| 0.9659722222222222 | 0 |
| 0.9666666666666667 | 0 |
| 0.967361111111111 | 0 |
| 0.9680555555555556 | 0 |
| 0.96875 | 0 |
| 0.9694444444444444 | 0 |
| 0.970138888888889 | 0 |
| 0.9708333333333333 | 0 |
| 0.9715277777777778 | 0 |
| 0.9722222222222222 | 0 |
| 0.9729166666666668 | 0 |
| 0.9736111111111111 | 0 |
| 0.9743055555555555 | 0 |
| 0.975 | 0 |
| 0.9756944444444445 | 0 |
| 0.9763888888888889 | 0 |
| 0.9770833333333333 | 0 |
| 0.9777777777777777 | 0 |
| 0.9784722222222223 | 0 |
| 0.9791666666666666 | 0 |
| 0.9798611111111111 | 0 |
| 0.9805555555555556 | 0 |
| 0.9812500000000001 | 0 |
| 0.9819444444444444 | 0 |
| 0.9826388888888888 | 0 |
| 0.9833333333333334 | 0 |
| 0.9840277777777778 | 0 |
| 0.9847222222222222 | 0 |
| 0.9854166666666666 | 0 |
| 0.9861111111111112 | 0 |
| 0.9868055555555556 | 0 |
| 0.9874999999999999 | 0 |
| 0.9881944444444444 | 0 |
| 0.9888888888888889 | 0 |
| 0.9895833333333334 | 0 |
| 0.9902777777777777 | 0 |
| 0.9909722222222223 | 0 |
| 0.9916666666666667 | 0 |
| 0.9923611111111111 | 0 |
| 0.9930555555555555 | 0 |
| 0.99375 | 0 |
| 0.9944444444444445 | 0 |
| 0.9951388888888889 | 0 |
| 0.9958333333333332 | 0 |
| 0.9965277777777778 | 0 |
| 0.9972222222222222 | 0 |
| 0.9979166666666667 | 0 |
| 0.998611111111111 | 0 |
| 0.9993055555555556 | 0 |